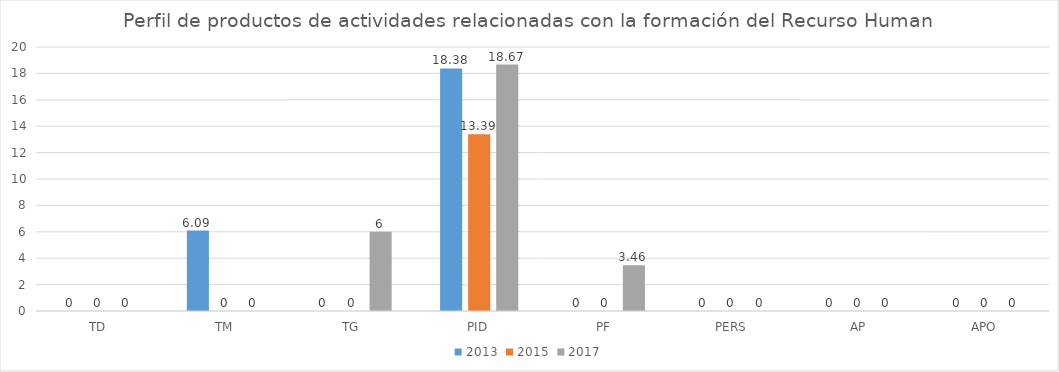
| Category | 2013 | 2015 | 2017 |
|---|---|---|---|
| TD | 0 | 0 | 0 |
| TM | 6.09 | 0 | 0 |
| TG | 0 | 0 | 6 |
| PID | 18.38 | 13.39 | 18.67 |
| PF | 0 | 0 | 3.46 |
| PERS | 0 | 0 | 0 |
| AP | 0 | 0 | 0 |
| APO | 0 | 0 | 0 |